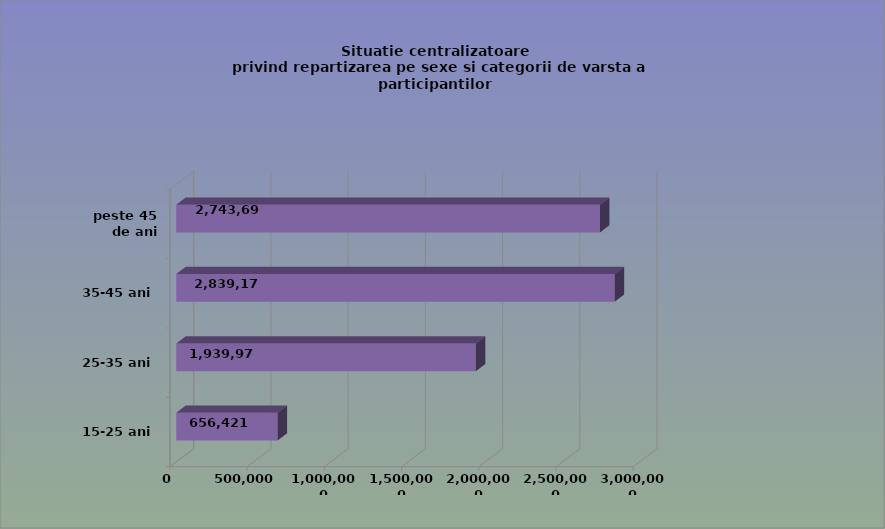
| Category | 15-25 ani 25-35 ani 35-45 ani peste 45 de ani |
|---|---|
| 15-25 ani | 656421 |
| 25-35 ani | 1939976 |
| 35-45 ani | 2839170 |
| peste 45 de ani | 2743692 |